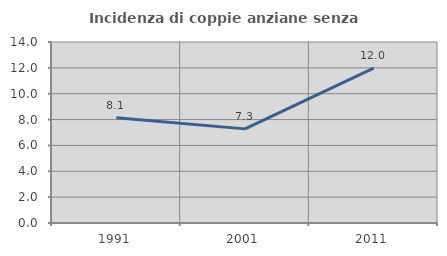
| Category | Incidenza di coppie anziane senza figli  |
|---|---|
| 1991.0 | 8.137 |
| 2001.0 | 7.281 |
| 2011.0 | 11.983 |